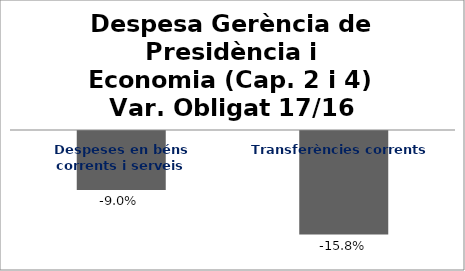
| Category | Series 0 |
|---|---|
| Despeses en béns corrents i serveis | -0.09 |
| Transferències corrents | -0.158 |